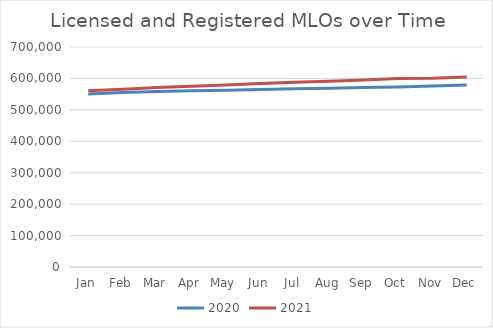
| Category | 2020 | 2021 |
|---|---|---|
| Jan | 550536 | 560465 |
| Feb | 555298 | 565696 |
| Mar | 558640 | 571121 |
| Apr | 560724 | 575419 |
| May | 562312 | 579324 |
| Jun | 565023 | 583668 |
| Jul | 567246 | 588023 |
| Aug | 569069 | 591343 |
| Sep | 571358 | 595392 |
| Oct | 573122 | 599729 |
| Nov | 575931 | 600769 |
| Dec | 579292 | 604773 |